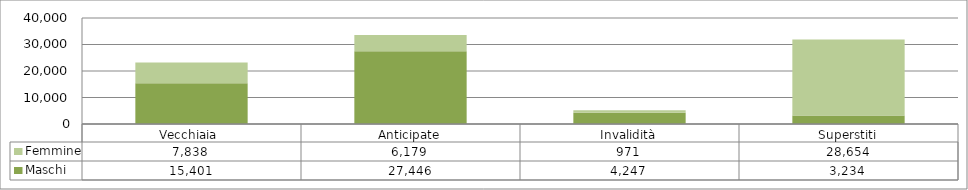
| Category | Maschi | Femmine |
|---|---|---|
| Vecchiaia  | 15401 | 7838 |
| Anticipate | 27446 | 6179 |
| Invalidità | 4247 | 971 |
| Superstiti | 3234 | 28654 |